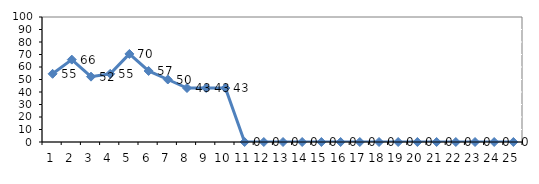
| Category | Series 0 |
|---|---|
| 0 | 54.545 |
| 1 | 65.909 |
| 2 | 52.273 |
| 3 | 54.545 |
| 4 | 70.455 |
| 5 | 56.818 |
| 6 | 50 |
| 7 | 43.182 |
| 8 | 43.182 |
| 9 | 43.182 |
| 10 | 0 |
| 11 | 0 |
| 12 | 0 |
| 13 | 0 |
| 14 | 0 |
| 15 | 0 |
| 16 | 0 |
| 17 | 0 |
| 18 | 0 |
| 19 | 0 |
| 20 | 0 |
| 21 | 0 |
| 22 | 0 |
| 23 | 0 |
| 24 | 0 |